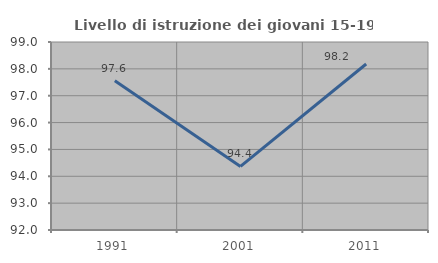
| Category | Livello di istruzione dei giovani 15-19 anni |
|---|---|
| 1991.0 | 97.561 |
| 2001.0 | 94.366 |
| 2011.0 | 98.182 |